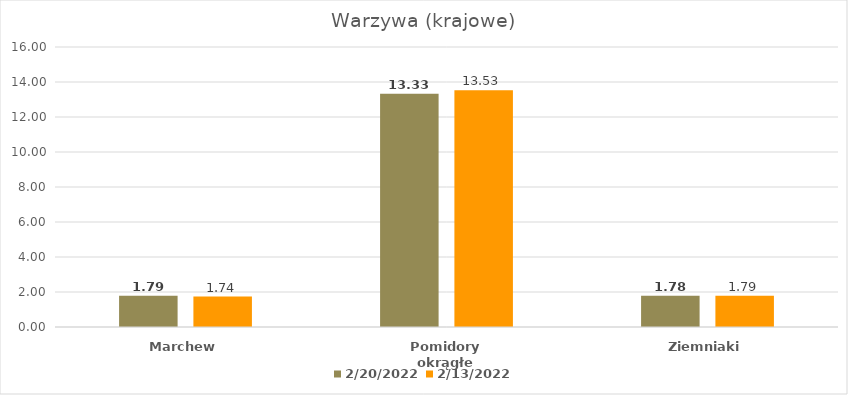
| Category | 20.02.2022 | 13.02.2022 |
|---|---|---|
| Marchew | 1.79 | 1.74 |
| Pomidory okrągłe | 13.33 | 13.53 |
| Ziemniaki | 1.78 | 1.79 |